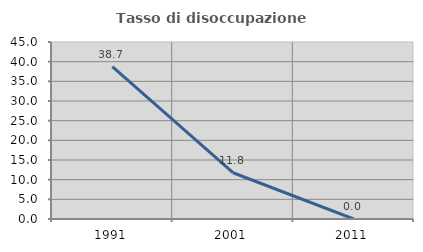
| Category | Tasso di disoccupazione giovanile  |
|---|---|
| 1991.0 | 38.71 |
| 2001.0 | 11.765 |
| 2011.0 | 0 |